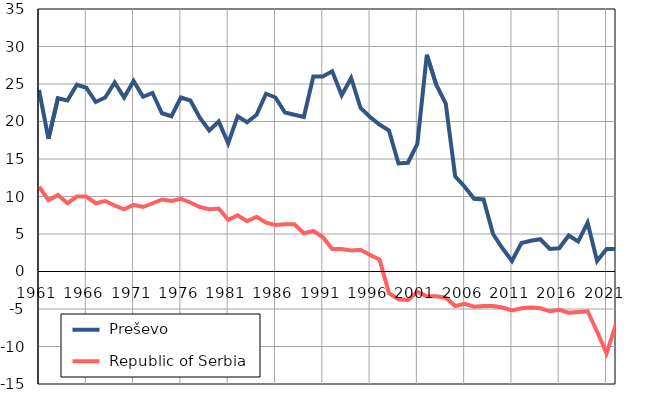
| Category |  Preševo |  Republic of Serbia |
|---|---|---|
| 1961.0 | 24.2 | 11.3 |
| 1962.0 | 17.7 | 9.5 |
| 1963.0 | 23.1 | 10.2 |
| 1964.0 | 22.8 | 9.1 |
| 1965.0 | 24.9 | 10 |
| 1966.0 | 24.5 | 10 |
| 1967.0 | 22.6 | 9.1 |
| 1968.0 | 23.2 | 9.4 |
| 1969.0 | 25.2 | 8.8 |
| 1970.0 | 23.2 | 8.3 |
| 1971.0 | 25.4 | 8.9 |
| 1972.0 | 23.3 | 8.6 |
| 1973.0 | 23.8 | 9.1 |
| 1974.0 | 21.1 | 9.6 |
| 1975.0 | 20.7 | 9.4 |
| 1976.0 | 23.2 | 9.7 |
| 1977.0 | 22.8 | 9.2 |
| 1978.0 | 20.5 | 8.6 |
| 1979.0 | 18.8 | 8.3 |
| 1980.0 | 20 | 8.4 |
| 1981.0 | 17.1 | 6.9 |
| 1982.0 | 20.7 | 7.5 |
| 1983.0 | 19.9 | 6.7 |
| 1984.0 | 20.9 | 7.3 |
| 1985.0 | 23.7 | 6.5 |
| 1986.0 | 23.2 | 6.2 |
| 1987.0 | 21.2 | 6.3 |
| 1988.0 | 20.9 | 6.3 |
| 1989.0 | 20.6 | 5.1 |
| 1990.0 | 26 | 5.4 |
| 1991.0 | 26 | 4.6 |
| 1992.0 | 26.7 | 3 |
| 1993.0 | 23.5 | 3 |
| 1994.0 | 25.8 | 2.8 |
| 1995.0 | 21.8 | 2.9 |
| 1996.0 | 20.6 | 2.2 |
| 1997.0 | 19.6 | 1.6 |
| 1998.0 | 18.8 | -2.9 |
| 1999.0 | 14.4 | -3.7 |
| 2000.0 | 14.5 | -3.8 |
| 2001.0 | 17 | -2.7 |
| 2002.0 | 28.9 | -3.3 |
| 2003.0 | 24.9 | -3.3 |
| 2004.0 | 22.4 | -3.5 |
| 2005.0 | 12.7 | -4.6 |
| 2006.0 | 11.3 | -4.3 |
| 2007.0 | 9.7 | -4.7 |
| 2008.0 | 9.6 | -4.6 |
| 2009.0 | 5 | -4.6 |
| 2010.0 | 3.1 | -4.8 |
| 2011.0 | 1.4 | -5.2 |
| 2012.0 | 3.8 | -4.9 |
| 2013.0 | 4.1 | -4.8 |
| 2014.0 | 4.3 | -4.9 |
| 2015.0 | 3 | -5.3 |
| 2016.0 | 3.1 | -5.1 |
| 2017.0 | 4.8 | -5.5 |
| 2018.0 | 4 | -5.4 |
| 2019.0 | 6.5 | -5.3 |
| 2020.0 | 1.4 | -8 |
| 2021.0 | 3 | -10.9 |
| 2022.0 | 3 | -7 |